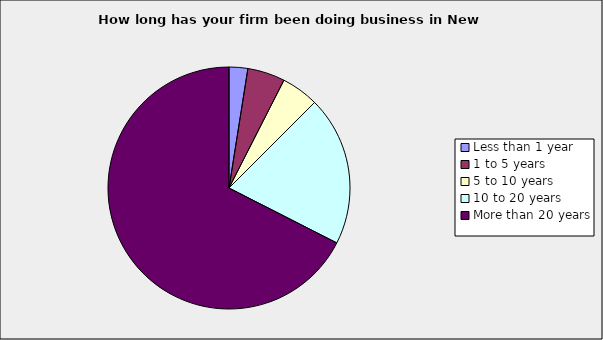
| Category | Series 0 |
|---|---|
| Less than 1 year | 0.025 |
| 1 to 5 years | 0.05 |
| 5 to 10 years | 0.05 |
| 10 to 20 years | 0.2 |
| More than 20 years | 0.675 |